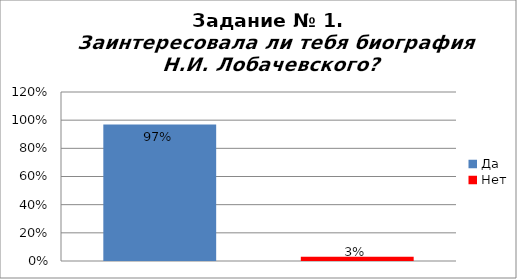
| Category | Заинтересовала ли тебя биография Н.И. Лобачевского? |
|---|---|
| Да | 0.97 |
| Нет | 0.03 |